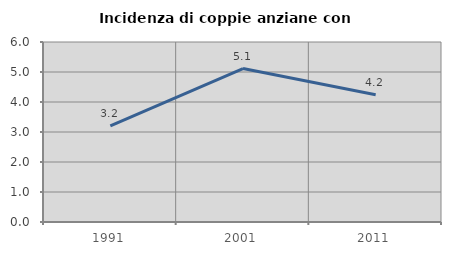
| Category | Incidenza di coppie anziane con figli |
|---|---|
| 1991.0 | 3.205 |
| 2001.0 | 5.116 |
| 2011.0 | 4.241 |